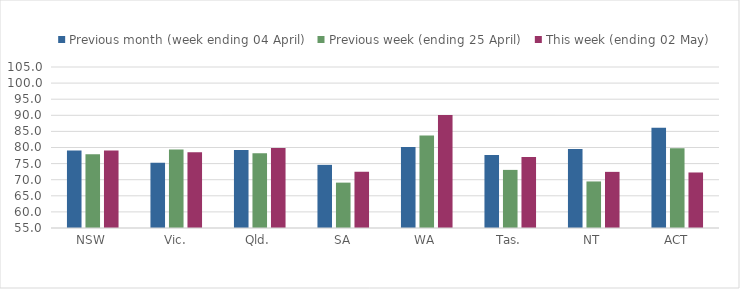
| Category | Previous month (week ending 04 April) | Previous week (ending 25 April) | This week (ending 02 May) |
|---|---|---|---|
| NSW | 79.034 | 77.902 | 79.037 |
| Vic. | 75.251 | 79.351 | 78.509 |
| Qld. | 79.197 | 78.181 | 79.819 |
| SA | 74.608 | 69.091 | 72.47 |
| WA | 80.125 | 83.695 | 90.131 |
| Tas. | 77.678 | 73.048 | 77.024 |
| NT | 79.528 | 69.455 | 72.432 |
| ACT | 86.102 | 79.733 | 72.243 |